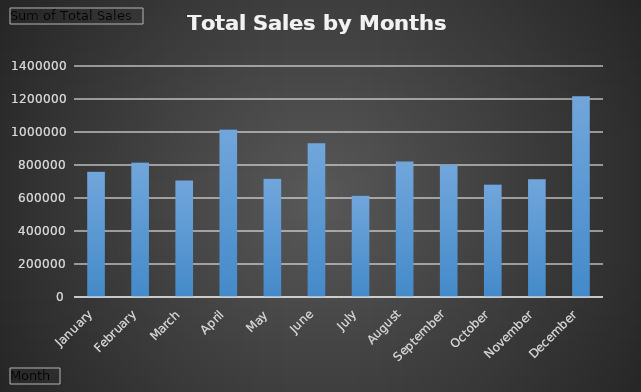
| Category | Total |
|---|---|
| January | 758570 |
| February | 814750 |
| March | 706672 |
| April | 1014870 |
| May | 716838 |
| June | 932280 |
| July | 613228 |
| August | 821281 |
| September | 800850 |
| October | 681512 |
| November | 713070 |
| December | 1216108 |